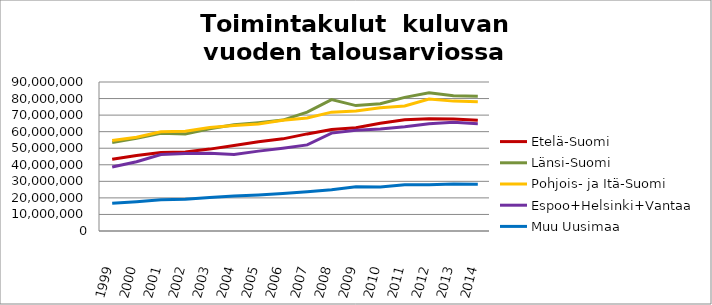
| Category | Etelä-Suomi | Länsi-Suomi | Pohjois- ja Itä-Suomi | Espoo+Helsinki+Vantaa | Muu Uusimaa |
|---|---|---|---|---|---|
| 1999.0 | 43305945.77 | 53432180.34 | 54625133.51 | 38684820.88 | 16732780.81 |
| 2000.0 | 45639407.94 | 56012513.73 | 56624558.8 | 41853901.87 | 17725493.75 |
| 2001.0 | 47437503.7 | 59086549.56 | 59931834.48 | 46175095.24 | 18917155.17 |
| 2002.0 | 47757680 | 58659524 | 60311891 | 46738180 | 19242180 |
| 2003.0 | 49463985 | 61719777 | 62563369 | 46895220 | 20226870 |
| 2004.0 | 51695147 | 64150639 | 63751236 | 46149000 | 21072264 |
| 2005.0 | 53888641 | 65433329 | 64689847 | 48241000 | 21815088 |
| 2006.0 | 55659424 | 66998095 | 66829306 | 50016000 | 22615314 |
| 2007.0 | 58650210 | 71760874 | 68221988 | 51997863 | 23650150 |
| 2008.0 | 61299689 | 79382060.57 | 71791532 | 59128595 | 24983443 |
| 2009.0 | 62323496 | 75743192 | 72450986 | 60844831 | 26754629.93 |
| 2010.0 | 65096109 | 76817970 | 74406731 | 61670846 | 26510635.8 |
| 2011.0 | 67166538 | 80720572 | 75557546 | 62966023.31 | 27883225.48 |
| 2012.0 | 67767282.1 | 83541933 | 79711530 | 64760373.54 | 27944502.48 |
| 2013.0 | 67582465 | 81768348.26 | 78448846 | 65643903.23 | 28431783 |
| 2014.0 | 66900545.36 | 81348973.6 | 78005749 | 64836640.13 | 28212734 |